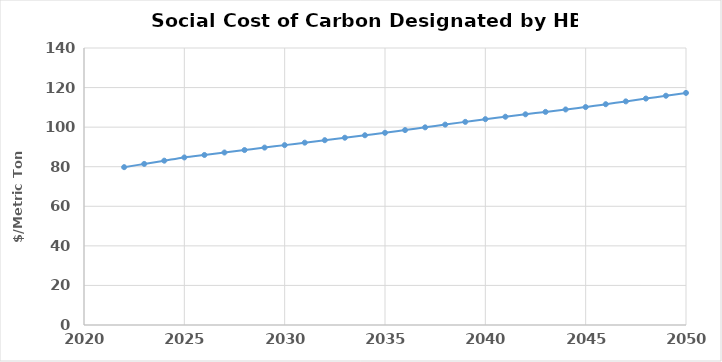
| Category | Series 0 |
|---|---|
| nan | 0 |
| 2022.0 | 79.775 |
| 2023.0 | 81.413 |
| 2024.0 | 83.05 |
| 2025.0 | 84.688 |
| 2026.0 | 85.933 |
| 2027.0 | 87.178 |
| 2028.0 | 88.424 |
| 2029.0 | 89.669 |
| 2030.0 | 90.915 |
| 2031.0 | 92.16 |
| 2032.0 | 93.405 |
| 2033.0 | 94.651 |
| 2034.0 | 95.896 |
| 2035.0 | 97.142 |
| 2036.0 | 98.521 |
| 2037.0 | 99.901 |
| 2038.0 | 101.281 |
| 2039.0 | 102.66 |
| 2040.0 | 104.04 |
| 2041.0 | 105.264 |
| 2042.0 | 106.488 |
| 2043.0 | 107.712 |
| 2044.0 | 108.936 |
| 2045.0 | 110.16 |
| 2046.0 | 111.588 |
| 2047.0 | 113.016 |
| 2048.0 | 114.444 |
| 2049.0 | 115.872 |
| 2050.0 | 117.3 |